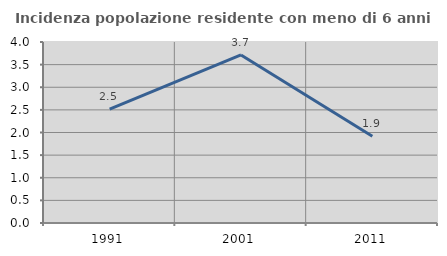
| Category | Incidenza popolazione residente con meno di 6 anni |
|---|---|
| 1991.0 | 2.516 |
| 2001.0 | 3.714 |
| 2011.0 | 1.917 |